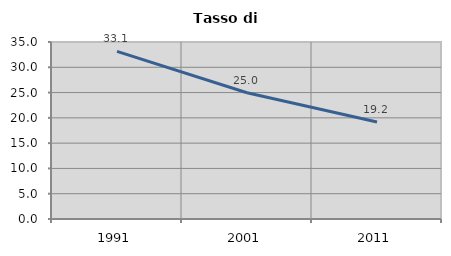
| Category | Tasso di disoccupazione   |
|---|---|
| 1991.0 | 33.14 |
| 2001.0 | 24.957 |
| 2011.0 | 19.188 |